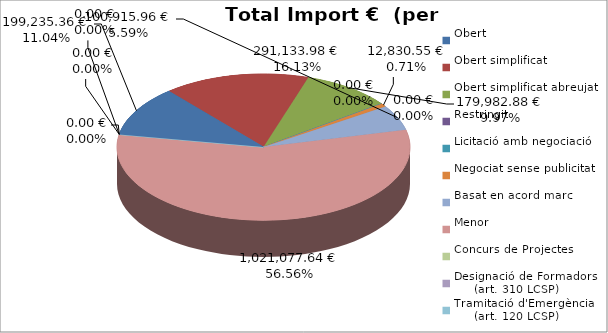
| Category | Total preu
(amb IVA) |
|---|---|
| Obert | 199235.36 |
| Obert simplificat | 291133.98 |
| Obert simplificat abreujat | 179982.88 |
| Restringit | 0 |
| Licitació amb negociació | 0 |
| Negociat sense publicitat | 12830.55 |
| Basat en acord marc | 100915.96 |
| Menor | 1021077.64 |
| Concurs de Projectes | 0 |
| Designació de Formadors
     (art. 310 LCSP) | 0 |
| Tramitació d'Emergència
     (art. 120 LCSP) | 0 |